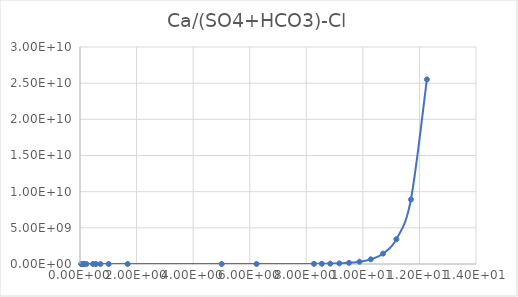
| Category | Series 0 |
|---|---|
| 0.045798 | 4.391 |
| 0.050886 | 4.433 |
| 0.057258 | 4.483 |
| 0.065456 | 4.543 |
| 0.076369 | 4.618 |
| 0.091683 | 4.718 |
| 0.11463 | 4.861 |
| 0.15298 | 5.095 |
| 0.2297 | 5.579 |
| 0.46159 | 7.455 |
| 0.56399 | 8.568 |
| 0.72477 | 10.775 |
| 1.0138 | 16.868 |
| 1.6863 | 55.504 |
| 5.0106 | 35971.845 |
| 6.241 | 380980.32 |
| 8.2722 | 16997001.361 |
| 8.5505 | 28193982.512 |
| 8.8482 | 48303637.663 |
| 9.1674 | 85879376.301 |
| 9.5104 | 159458163.766 |
| 9.8801 | 311549052.121 |
| 10.28 | 645762957.648 |
| 10.713 | 1431883311.836 |
| 11.185 | 3425015694.436 |
| 11.699 | 8916412038.905 |
| 12.264 | 25524642280.752 |